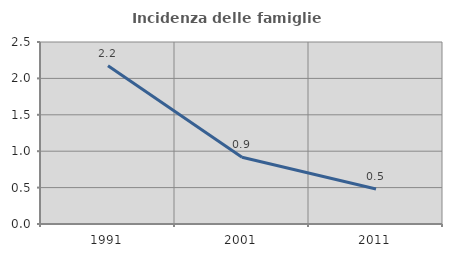
| Category | Incidenza delle famiglie numerose |
|---|---|
| 1991.0 | 2.174 |
| 2001.0 | 0.917 |
| 2011.0 | 0.481 |